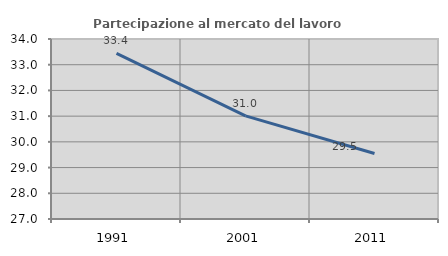
| Category | Partecipazione al mercato del lavoro  femminile |
|---|---|
| 1991.0 | 33.438 |
| 2001.0 | 31.008 |
| 2011.0 | 29.548 |